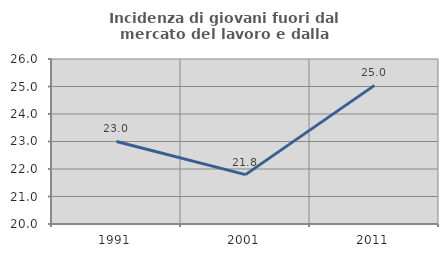
| Category | Incidenza di giovani fuori dal mercato del lavoro e dalla formazione  |
|---|---|
| 1991.0 | 23.001 |
| 2001.0 | 21.795 |
| 2011.0 | 25.041 |